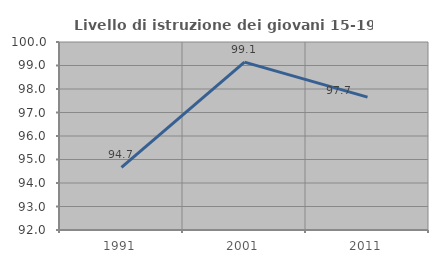
| Category | Livello di istruzione dei giovani 15-19 anni |
|---|---|
| 1991.0 | 94.667 |
| 2001.0 | 99.145 |
| 2011.0 | 97.656 |